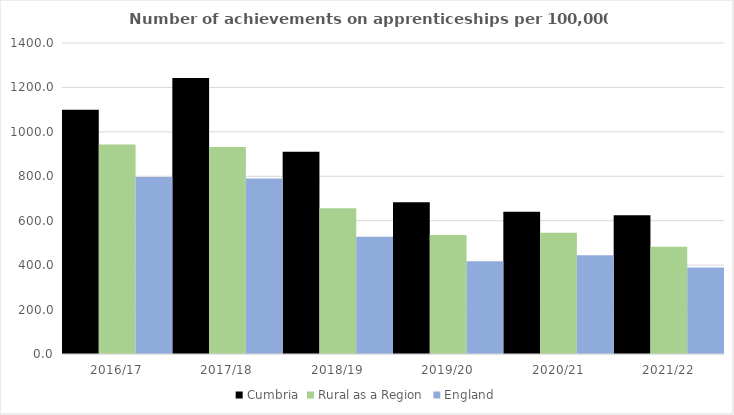
| Category | Cumbria | Rural as a Region | England |
|---|---|---|---|
| 2016/17 | 1099.72 | 942.594 | 797 |
| 2017/18 | 1242.701 | 931.709 | 790 |
| 2018/19 | 910.393 | 656.44 | 528 |
| 2019/20 | 682.82 | 535.552 | 418 |
| 2020/21 | 639.907 | 545.333 | 444 |
| 2021/22 | 624.977 | 482.936 | 389 |